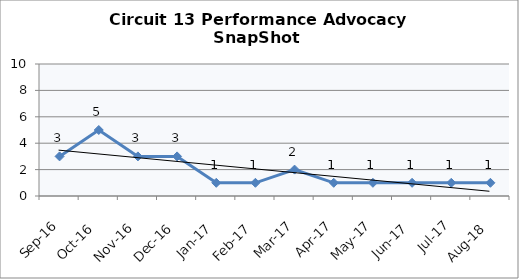
| Category | Circuit 13 |
|---|---|
| Sep-16 | 3 |
| Oct-16 | 5 |
| Nov-16 | 3 |
| Dec-16 | 3 |
| Jan-17 | 1 |
| Feb-17 | 1 |
| Mar-17 | 2 |
| Apr-17 | 1 |
| May-17 | 1 |
| Jun-17 | 1 |
| Jul-17 | 1 |
| Aug-18 | 1 |